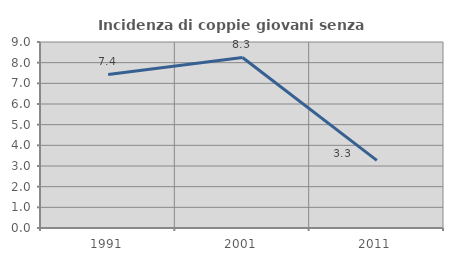
| Category | Incidenza di coppie giovani senza figli |
|---|---|
| 1991.0 | 7.429 |
| 2001.0 | 8.252 |
| 2011.0 | 3.271 |